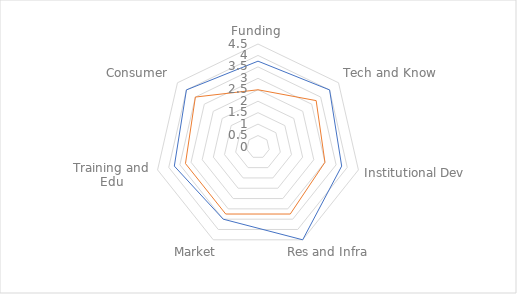
| Category | Level of support required | Level of support perceived |
|---|---|---|
| Funding | 3.75 | 2.5 |
| Tech and Know | 4 | 3.25 |
| Institutional Dev | 3.75 | 3 |
| Res and Infra | 4.5 | 3.25 |
| Market | 3.5 | 3.25 |
| Training and Edu | 3.75 | 3.25 |
| Consumer | 4 | 3.5 |